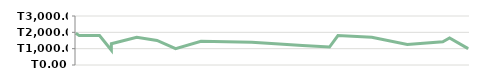
| Category | ТАБЫС |
|---|---|
| 2013-04-23 | 1950 |
| 2013-04-25 | 1800 |
| 2013-05-07 | 1800 |
| 2013-05-14 | 900 |
| 2013-05-14 | 1300 |
| 2013-05-29 | 1700 |
| 2013-06-10 | 1500 |
| 2013-06-21 | 1000 |
| 2013-07-06 | 1450 |
| 2013-08-05 | 1400 |
| 2013-08-19 | 1300 |
| 2013-09-04 | 1200 |
| 2013-09-20 | 1100 |
| 2013-09-25 | 1800 |
| 2013-10-15 | 1700 |
| 2013-11-05 | 1250 |
| 2013-11-26 | 1425 |
| 2013-11-30 | 1650 |
| 2013-12-11 | 1000 |